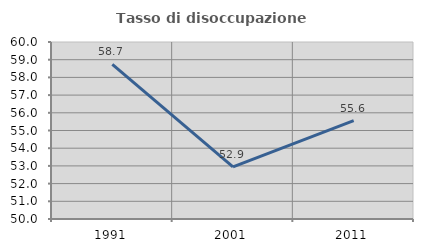
| Category | Tasso di disoccupazione giovanile  |
|---|---|
| 1991.0 | 58.73 |
| 2001.0 | 52.941 |
| 2011.0 | 55.556 |